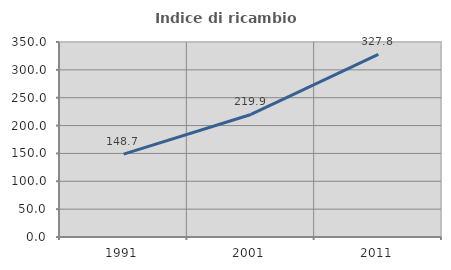
| Category | Indice di ricambio occupazionale  |
|---|---|
| 1991.0 | 148.678 |
| 2001.0 | 219.925 |
| 2011.0 | 327.833 |